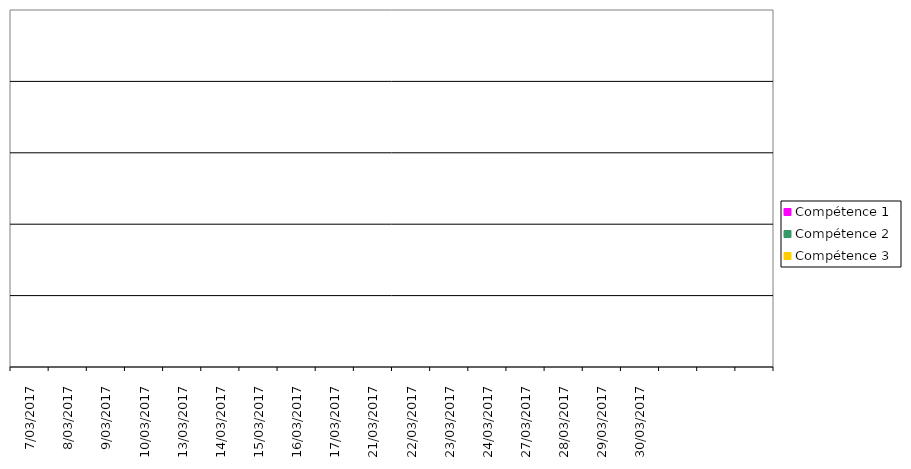
| Category | Compétence 1 | Compétence 2 | Compétence 3 |
|---|---|---|---|
| 7/03/2017 | 0 | 0 | 0 |
| 8/03/2017 | 0 | 0 | 0 |
| 9/03/2017 | 0 | 0 | 0 |
| 10/03/2017 | 0 | 0 | 0 |
| 13/03/2017 | 0 | 0 | 0 |
| 14/03/2017 | 0 | 0 | 0 |
| 15/03/2017 | 0 | 0 | 0 |
| 16/03/2017 | 0 | 0 | 0 |
| 17/03/2017 | 0 | 0 | 0 |
| 21/03/2017 | 0 | 0 | 0 |
| 22/03/2017 | 0 | 0 | 0 |
| 23/03/2017 | 0 | 0 | 0 |
| 24/03/2017 | 0 | 0 | 0 |
| 27/03/2017 | 0 | 0 | 0 |
| 28/03/2017 | 0 | 0 | 0 |
| 29/03/2017 | 0 | 0 | 0 |
| 30/03/2017 | 0 | 0 | 0 |